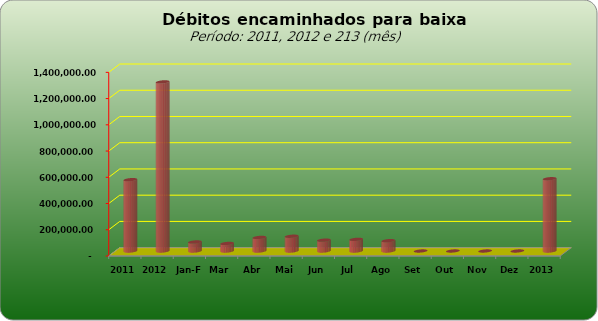
| Category |  543.796,20   1.288.982,12   68.983,48   57.649,63   103.629,52   112.546,24   82.743,05   88.789,93   78.810,72   -     -     -     -     550.961,92  |
|---|---|
| 2011 | 543796.2 |
| 2012 | 1288982.12 |
| Jan-Fev | 68983.48 |
| Mar | 57649.63 |
| Abr | 103629.52 |
| Mai | 112546.24 |
| Jun | 82743.05 |
| Jul | 88789.93 |
| Ago | 78810.72 |
| Set | 0 |
| Out | 0 |
| Nov | 0 |
| Dez | 0 |
| 2013 | 550961.92 |